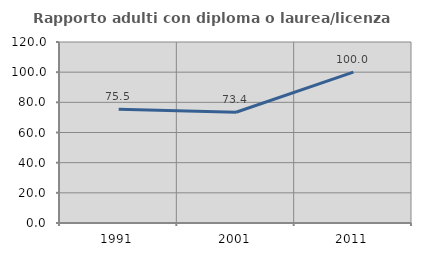
| Category | Rapporto adulti con diploma o laurea/licenza media  |
|---|---|
| 1991.0 | 75.472 |
| 2001.0 | 73.418 |
| 2011.0 | 100 |